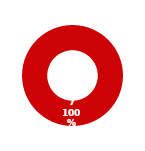
| Category | PRIVACY |
|---|---|
| MIL 2 Complete | 0 |
| MIL 2 Not Complete | 7 |